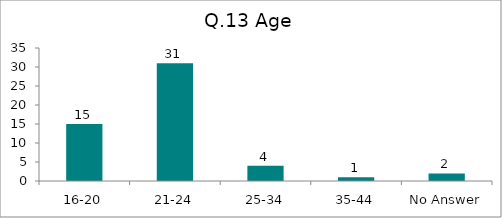
| Category | Q.13 Age |
|---|---|
| 16-20 | 15 |
| 21-24 | 31 |
| 25-34 | 4 |
| 35-44 | 1 |
| No Answer | 2 |